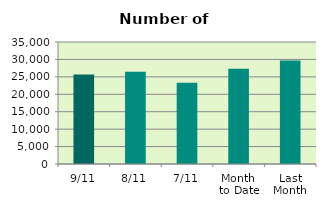
| Category | Series 0 |
|---|---|
| 9/11 | 25680 |
| 8/11 | 26474 |
| 7/11 | 23326 |
| Month 
to Date | 27339.714 |
| Last
Month | 29672.087 |